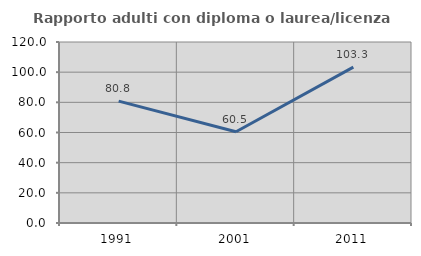
| Category | Rapporto adulti con diploma o laurea/licenza media  |
|---|---|
| 1991.0 | 80.769 |
| 2001.0 | 60.526 |
| 2011.0 | 103.333 |